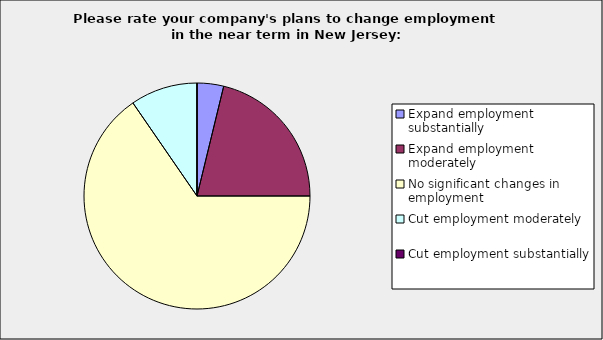
| Category | Series 0 |
|---|---|
| Expand employment substantially | 0.038 |
| Expand employment moderately | 0.212 |
| No significant changes in employment | 0.654 |
| Cut employment moderately | 0.096 |
| Cut employment substantially | 0 |